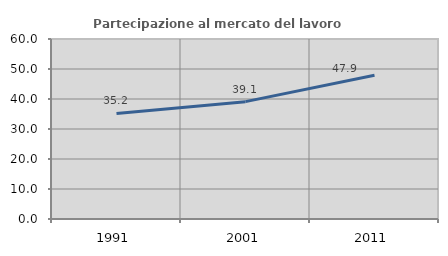
| Category | Partecipazione al mercato del lavoro  femminile |
|---|---|
| 1991.0 | 35.197 |
| 2001.0 | 39.117 |
| 2011.0 | 47.944 |